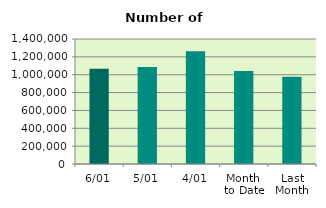
| Category | Series 0 |
|---|---|
| 6/01 | 1066858 |
| 5/01 | 1085028 |
| 4/01 | 1261772 |
| Month 
to Date | 1040543.2 |
| Last
Month | 976608.095 |